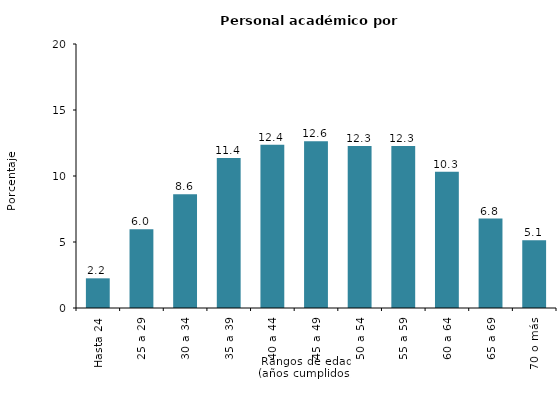
| Category | Series 0 |
|---|---|
| Hasta 24 | 2.248 |
| 25 a 29 | 5.969 |
| 30 a 34 | 8.62 |
| 35 a 39 | 11.366 |
| 40 a 44 | 12.376 |
| 45 a 49 | 12.625 |
| 50 a 54 | 12.278 |
| 55 a 59 | 12.28 |
| 60 a 64 | 10.326 |
| 65 a 69 | 6.777 |
| 70 o más | 5.136 |